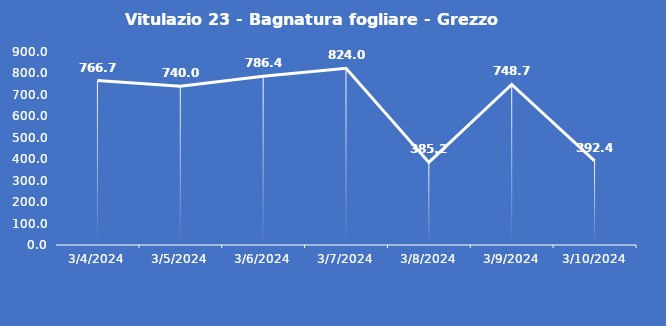
| Category | Vitulazio 23 - Bagnatura fogliare - Grezzo (min) |
|---|---|
| 3/4/24 | 766.7 |
| 3/5/24 | 740 |
| 3/6/24 | 786.4 |
| 3/7/24 | 824 |
| 3/8/24 | 385.2 |
| 3/9/24 | 748.7 |
| 3/10/24 | 392.4 |